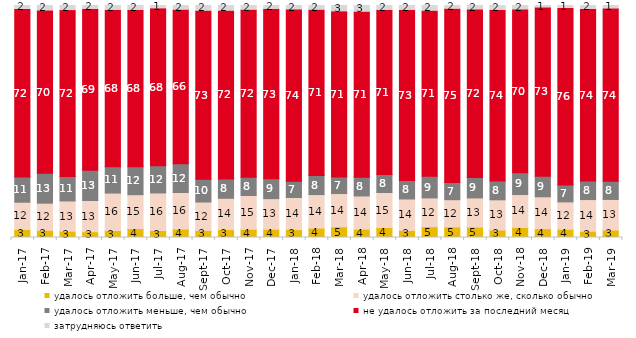
| Category | удалось отложить больше, чем обычно | удалось отложить столько же, сколько обычно | удалось отложить меньше, чем обычно | не удалось отложить за последний месяц | затрудняюсь ответить |
|---|---|---|---|---|---|
| 2017-01-01 | 3.45 | 11.75 | 10.9 | 72.2 | 1.7 |
| 2017-02-01 | 3.1 | 11.7 | 12.85 | 70.05 | 2.3 |
| 2017-03-01 | 2.7 | 13.05 | 10.55 | 71.5 | 2.2 |
| 2017-04-01 | 2.5 | 13.45 | 13 | 69.4 | 1.6 |
| 2017-05-01 | 3 | 16.15 | 11.35 | 67.5 | 2 |
| 2017-06-01 | 3.85 | 14.6 | 12 | 67.5 | 2.05 |
| 2017-07-01 | 3 | 16.2 | 11.75 | 67.7 | 1.35 |
| 2017-08-01 | 3.65 | 15.75 | 12.4 | 66.3 | 1.9 |
| 2017-09-01 | 3.05 | 12.25 | 9.8 | 72.55 | 2.35 |
| 2017-10-01 | 3.4 | 13.5 | 8.3 | 72.45 | 2.35 |
| 2017-11-01 | 3.55 | 14.55 | 7.85 | 72.05 | 1.95 |
| 2017-12-01 | 3.55 | 13.2 | 8.55 | 73.1 | 1.6 |
| 2018-01-01 | 3.45 | 13.8 | 7 | 73.9 | 1.85 |
| 2018-02-01 | 4.05 | 14.45 | 8.25 | 71.3 | 1.95 |
| 2018-03-01 | 4.6 | 14.35 | 7.1 | 71.3 | 2.65 |
| 2018-04-01 | 3.6 | 14.3 | 8.05 | 71.25 | 2.8 |
| 2018-05-01 | 4.3 | 15.1 | 7.75 | 70.75 | 2.1 |
| 2018-06-01 | 3.05 | 13.55 | 7.95 | 73.4 | 2.05 |
| 2018-07-01 | 4.65 | 12.4 | 9.35 | 71.2 | 2.4 |
| 2018-08-01 | 4.55 | 11.75 | 7.45 | 74.7 | 1.55 |
| 2018-09-01 | 4.5 | 12.55 | 8.8 | 72.3 | 1.85 |
| 2018-10-01 | 3.2 | 13.05 | 8.05 | 73.6 | 2.1 |
| 2018-11-01 | 4.341 | 14.172 | 9.381 | 70.259 | 1.846 |
| 2018-12-01 | 3.8 | 13.75 | 8.9 | 72.55 | 1 |
| 2019-01-01 | 3.55 | 11.8 | 7.25 | 76.1 | 1.3 |
| 2019-02-01 | 2.7 | 13.65 | 7.95 | 74.05 | 1.65 |
| 2019-03-01 | 3.182 | 13.227 | 7.857 | 74.291 | 1.442 |